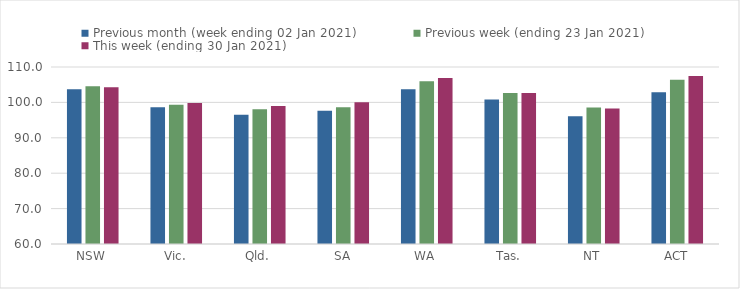
| Category | Previous month (week ending 02 Jan 2021) | Previous week (ending 23 Jan 2021) | This week (ending 30 Jan 2021) |
|---|---|---|---|
| NSW | 103.69 | 104.57 | 104.31 |
| Vic. | 98.63 | 99.35 | 99.82 |
| Qld. | 96.5 | 98.07 | 98.95 |
| SA | 97.67 | 98.66 | 100.01 |
| WA | 103.74 | 105.94 | 106.89 |
| Tas. | 100.81 | 102.63 | 102.63 |
| NT | 96.11 | 98.54 | 98.3 |
| ACT | 102.84 | 106.38 | 107.45 |